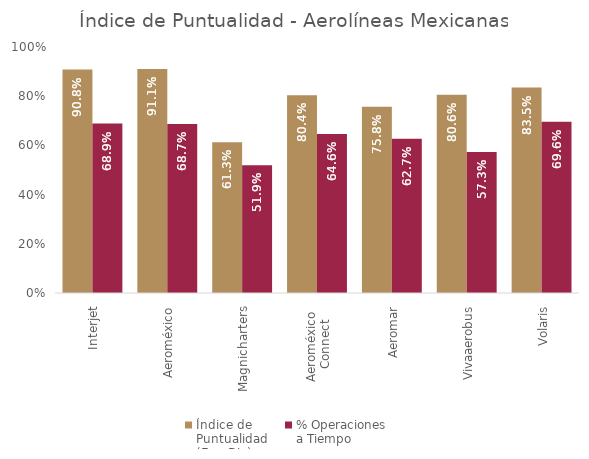
| Category | Índice de 
Puntualidad
(Ene-Dic) | % Operaciones 
a Tiempo |
|---|---|---|
| Interjet | 0.908 | 0.689 |
| Aeroméxico | 0.911 | 0.687 |
| Magnicharters | 0.613 | 0.519 |
| Aeroméxico 
Connect | 0.804 | 0.646 |
| Aeromar | 0.758 | 0.627 |
| Vivaaerobus | 0.806 | 0.573 |
| Volaris | 0.835 | 0.696 |